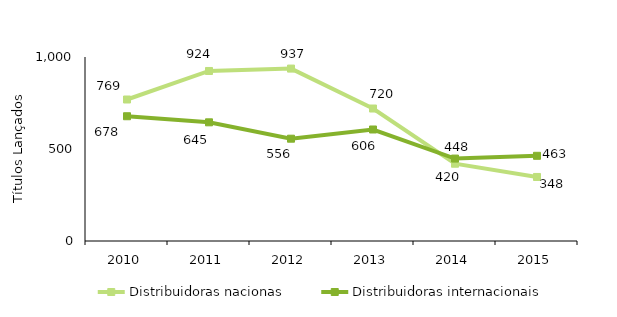
| Category | Distribuidoras nacionas | Distribuidoras internacionais |
|---|---|---|
| 2010.0 | 769 | 678 |
| 2011.0 | 924 | 645 |
| 2012.0 | 937 | 556 |
| 2013.0 | 720 | 606 |
| 2014.0 | 420 | 448 |
| 2015.0 | 348 | 463 |